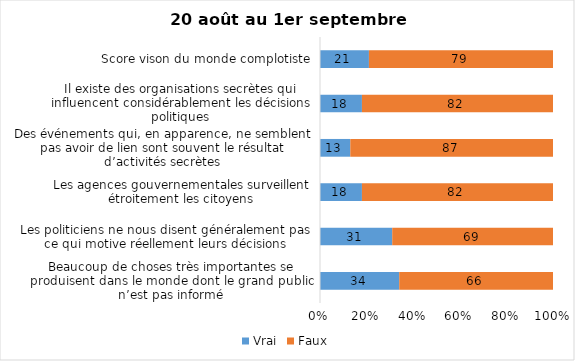
| Category | Vrai | Faux |
|---|---|---|
| Beaucoup de choses très importantes se produisent dans le monde dont le grand public n’est pas informé | 34 | 66 |
| Les politiciens ne nous disent généralement pas ce qui motive réellement leurs décisions | 31 | 69 |
| Les agences gouvernementales surveillent étroitement les citoyens | 18 | 82 |
| Des événements qui, en apparence, ne semblent pas avoir de lien sont souvent le résultat d’activités secrètes | 13 | 87 |
| Il existe des organisations secrètes qui influencent considérablement les décisions politiques | 18 | 82 |
| Score vison du monde complotiste | 21 | 79 |